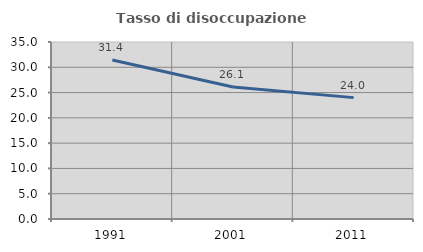
| Category | Tasso di disoccupazione giovanile  |
|---|---|
| 1991.0 | 31.429 |
| 2001.0 | 26.087 |
| 2011.0 | 24 |